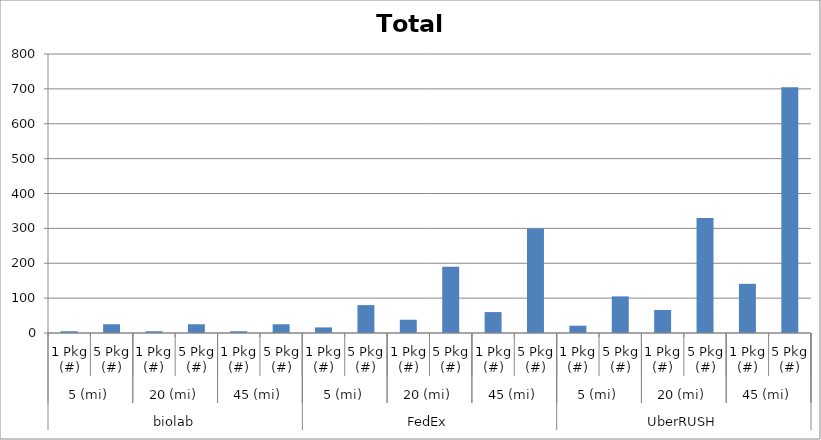
| Category | Total |
|---|---|
| 0 | 5 |
| 1 | 25 |
| 2 | 5 |
| 3 | 25 |
| 4 | 5 |
| 5 | 25 |
| 6 | 16 |
| 7 | 80 |
| 8 | 38 |
| 9 | 190 |
| 10 | 60 |
| 11 | 300 |
| 12 | 21 |
| 13 | 105 |
| 14 | 66 |
| 15 | 330 |
| 16 | 141 |
| 17 | 705 |